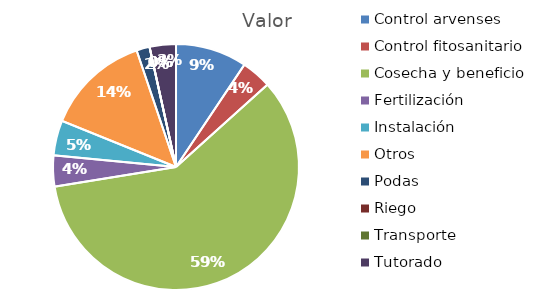
| Category | Valor |
|---|---|
| Control arvenses | 5320000 |
| Control fitosanitario | 2240000 |
| Cosecha y beneficio | 33530000 |
| Fertilización | 2310000 |
| Instalación | 2612728 |
| Otros | 7770000 |
| Podas | 980000 |
| Riego | 0 |
| Transporte | 0 |
| Tutorado | 1960000 |